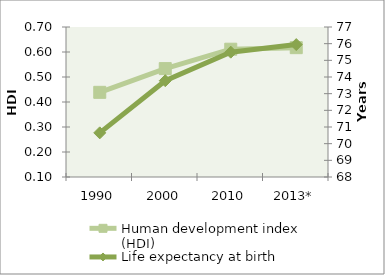
| Category | Human development index (HDI) |
|---|---|
| 1990 | 0.439 |
| 2000 | 0.534 |
| 2010 | 0.611 |
| 2013* | 0.617 |